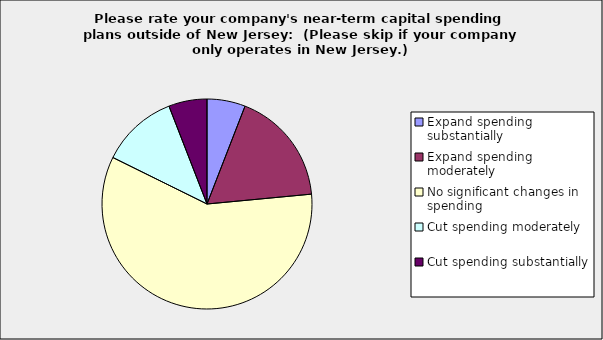
| Category | Series 0 |
|---|---|
| Expand spending substantially | 0.059 |
| Expand spending moderately | 0.176 |
| No significant changes in spending | 0.588 |
| Cut spending moderately | 0.118 |
| Cut spending substantially | 0.059 |